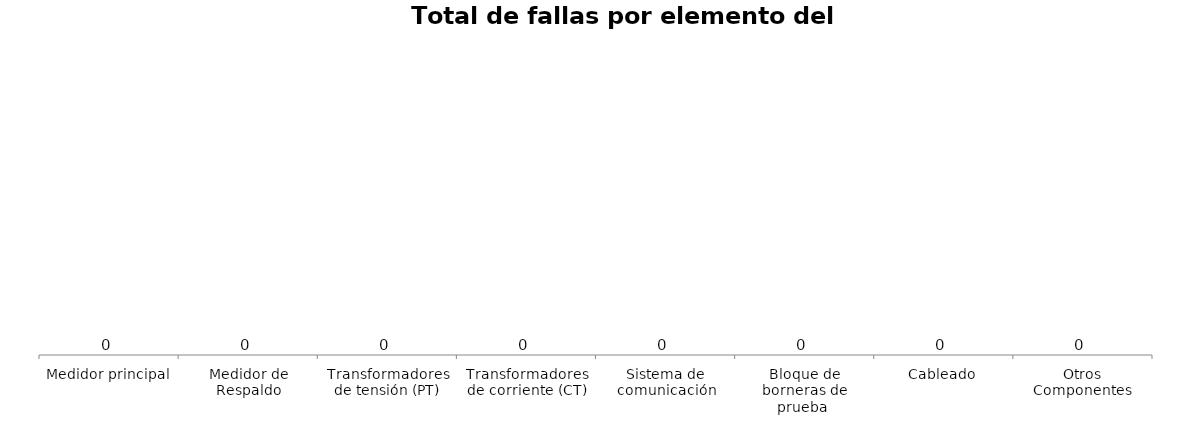
| Category | Fallas por elemento |
|---|---|
| Medidor principal | 0 |
| Medidor de Respaldo | 0 |
| Transformadores de tensión (PT) | 0 |
| Transformadores de corriente (CT) | 0 |
| Sistema de comunicación | 0 |
| Bloque de borneras de prueba  | 0 |
| Cableado | 0 |
| Otros Componentes | 0 |